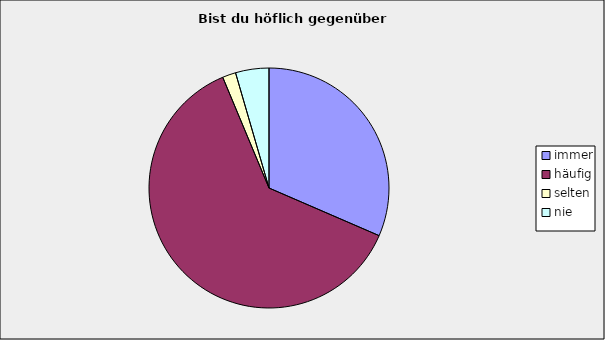
| Category | Series 0 |
|---|---|
| immer | 0.315 |
| häufig | 0.622 |
| selten | 0.018 |
| nie | 0.045 |